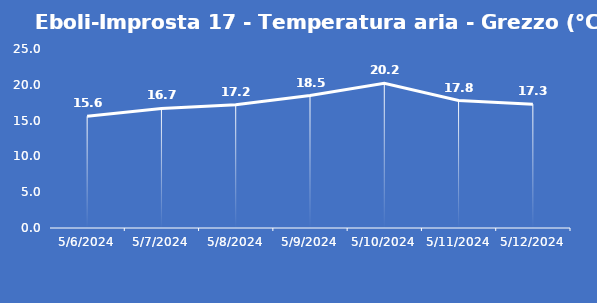
| Category | Eboli-Improsta 17 - Temperatura aria - Grezzo (°C) |
|---|---|
| 5/6/24 | 15.6 |
| 5/7/24 | 16.7 |
| 5/8/24 | 17.2 |
| 5/9/24 | 18.5 |
| 5/10/24 | 20.2 |
| 5/11/24 | 17.8 |
| 5/12/24 | 17.3 |